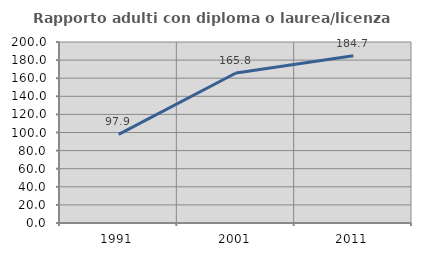
| Category | Rapporto adulti con diploma o laurea/licenza media  |
|---|---|
| 1991.0 | 97.876 |
| 2001.0 | 165.774 |
| 2011.0 | 184.72 |